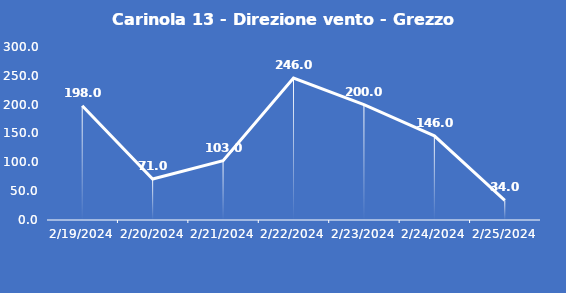
| Category | Carinola 13 - Direzione vento - Grezzo (°N) |
|---|---|
| 2/19/24 | 198 |
| 2/20/24 | 71 |
| 2/21/24 | 103 |
| 2/22/24 | 246 |
| 2/23/24 | 200 |
| 2/24/24 | 146 |
| 2/25/24 | 34 |